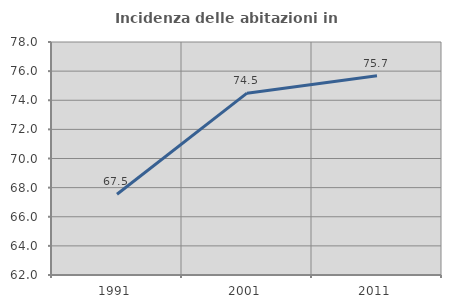
| Category | Incidenza delle abitazioni in proprietà  |
|---|---|
| 1991.0 | 67.545 |
| 2001.0 | 74.485 |
| 2011.0 | 75.685 |